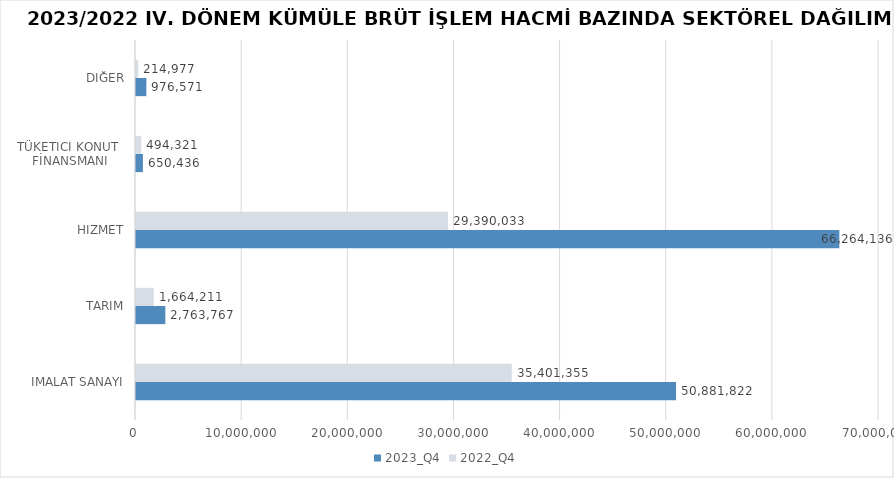
| Category | 2023_Q4 | 2022_Q4 |
|---|---|---|
| İMALAT SANAYİ | 50881821.686 | 35401354.619 |
| TARIM | 2763767.331 | 1664211.191 |
| HİZMET | 66264136.217 | 29390032.677 |
| TÜKETİCİ KONUT 
FİNANSMANI | 650436 | 494321 |
| DİĞER | 976571 | 214977 |